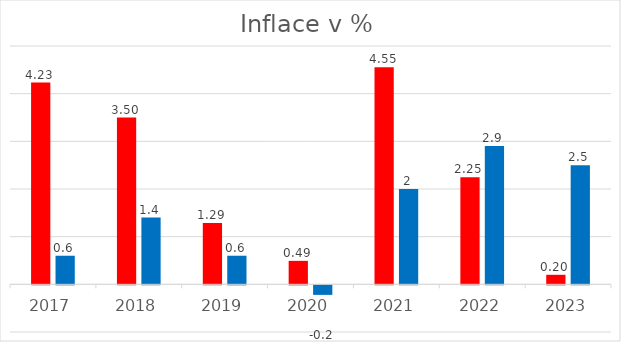
| Category | Čína | Taiwan |
|---|---|---|
| 2017.0 | 4.233 | 0.6 |
| 2018.0 | 3.5 | 1.4 |
| 2019.0 | 1.287 | 0.6 |
| 2020.0 | 0.492 | -0.2 |
| 2021.0 | 4.552 | 2 |
| 2022.0 | 2.249 | 2.9 |
| 2023.0 | 0.2 | 2.5 |